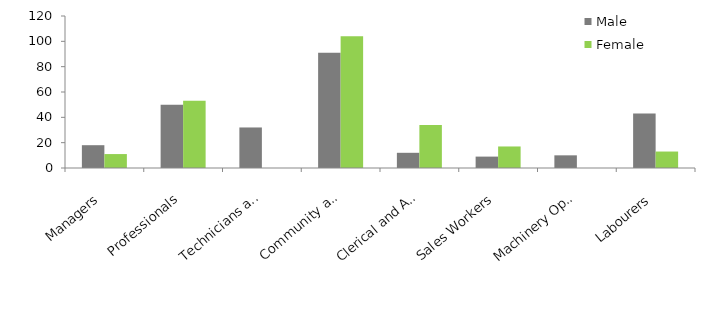
| Category | Male | Female |
|---|---|---|
| Managers | 18 | 11 |
| Professionals | 50 | 53 |
| Technicians and Trades Workers | 32 | 0 |
| Community and Personal Service Workers | 91 | 104 |
| Clerical and Administrative Workers | 12 | 34 |
| Sales Workers | 9 | 17 |
| Machinery Operators and Drivers | 10 | 0 |
| Labourers | 43 | 13 |